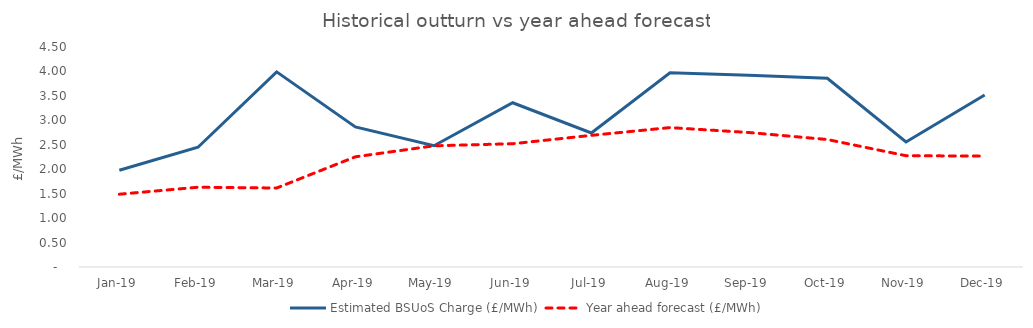
| Category | Estimated BSUoS Charge (£/MWh) | Year ahead forecast (£/MWh) |
|---|---|---|
| Jan-19 | 1.98 | 1.489 |
| Feb-19 | 2.449 | 1.632 |
| Mar-19 | 3.992 | 1.616 |
| Apr-19 | 2.866 | 2.254 |
| May-19 | 2.481 | 2.479 |
| Jun-19 | 3.359 | 2.522 |
| Jul-19 | 2.742 | 2.693 |
| Aug-19 | 3.974 | 2.852 |
| Sep-19 | 3.923 | 2.751 |
| Oct-19 | 3.861 | 2.607 |
| Nov-19 | 2.556 | 2.276 |
| Dec-19 | 3.517 | 2.269 |